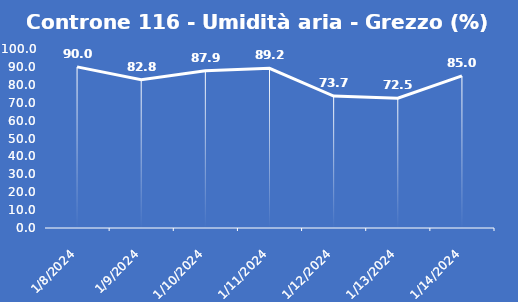
| Category | Controne 116 - Umidità aria - Grezzo (%) |
|---|---|
| 1/8/24 | 90 |
| 1/9/24 | 82.8 |
| 1/10/24 | 87.9 |
| 1/11/24 | 89.2 |
| 1/12/24 | 73.7 |
| 1/13/24 | 72.5 |
| 1/14/24 | 85 |